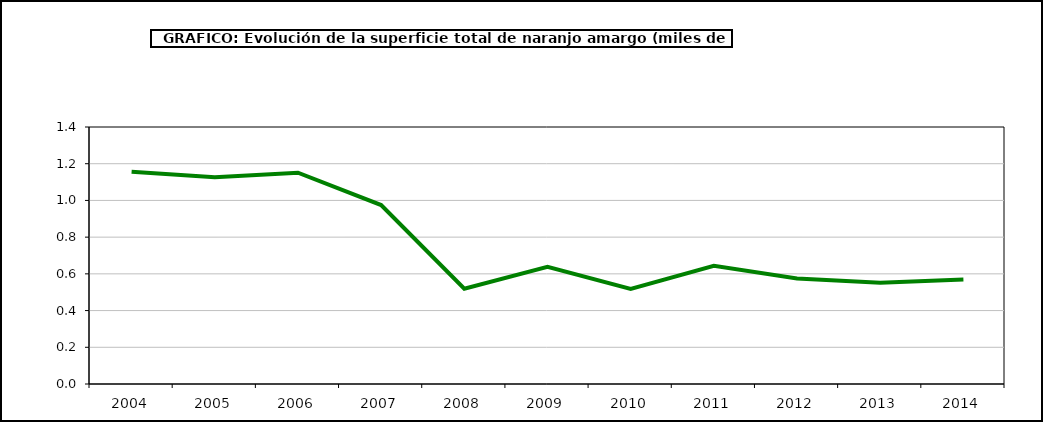
| Category | superficie |
|---|---|
| 2004.0 | 1.156 |
| 2005.0 | 1.126 |
| 2006.0 | 1.151 |
| 2007.0 | 0.975 |
| 2008.0 | 0.519 |
| 2009.0 | 0.639 |
| 2010.0 | 0.518 |
| 2011.0 | 0.644 |
| 2012.0 | 0.575 |
| 2013.0 | 0.552 |
| 2014.0 | 0.569 |